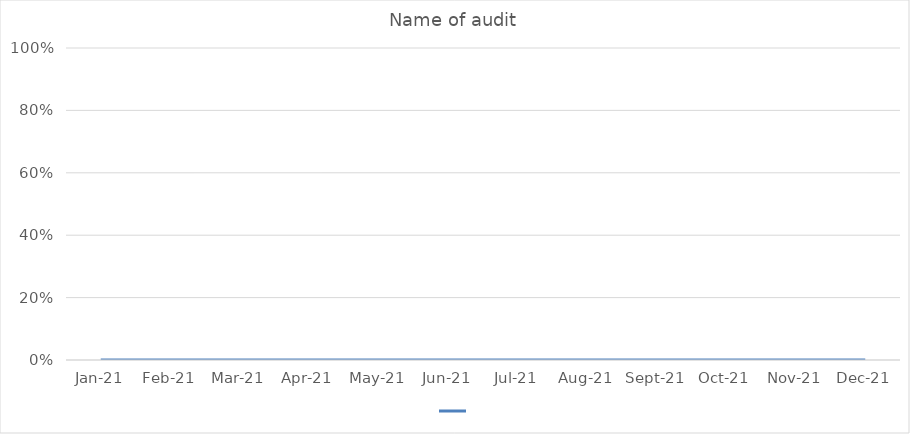
| Category | Series 0 |
|---|---|
| 2021-01-01 | 0 |
| 2021-02-01 | 0 |
| 2021-03-01 | 0 |
| 2021-04-01 | 0 |
| 2021-05-01 | 0 |
| 2021-06-01 | 0 |
| 2021-07-01 | 0 |
| 2021-08-01 | 0 |
| 2021-09-01 | 0 |
| 2021-10-01 | 0 |
| 2021-11-01 | 0 |
| 2021-12-01 | 0 |